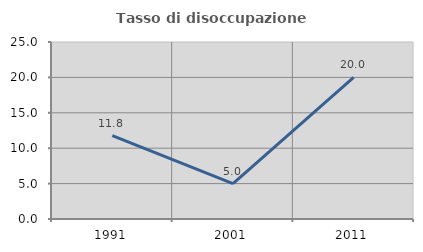
| Category | Tasso di disoccupazione giovanile  |
|---|---|
| 1991.0 | 11.765 |
| 2001.0 | 5 |
| 2011.0 | 20 |